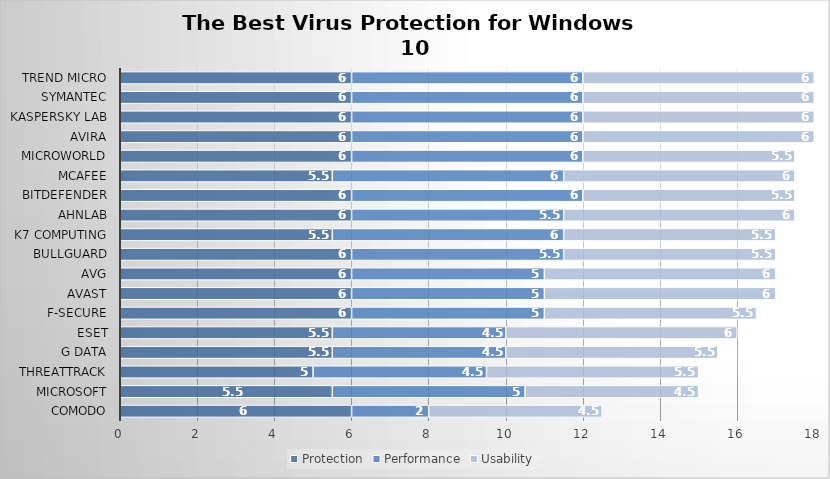
| Category | Protection | Performance | Usability |
|---|---|---|---|
| Comodo | 6 | 2 | 4.5 |
| Microsoft | 5.5 | 5 | 4.5 |
| ThreatTrack | 5 | 4.5 | 5.5 |
| G Data | 5.5 | 4.5 | 5.5 |
| ESET | 5.5 | 4.5 | 6 |
| F-Secure | 6 | 5 | 5.5 |
| Avast | 6 | 5 | 6 |
| AVG | 6 | 5 | 6 |
| BullGuard | 6 | 5.5 | 5.5 |
| K7 Computing | 5.5 | 6 | 5.5 |
| AhnLab | 6 | 5.5 | 6 |
| Bitdefender | 6 | 6 | 5.5 |
| McAfee | 5.5 | 6 | 6 |
| Microworld | 6 | 6 | 5.5 |
| Avira | 6 | 6 | 6 |
| Kaspersky Lab | 6 | 6 | 6 |
| Symantec | 6 | 6 | 6 |
| Trend Micro | 6 | 6 | 6 |